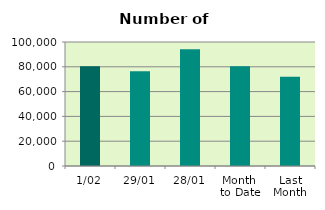
| Category | Series 0 |
|---|---|
| 1/02 | 80444 |
| 29/01 | 76356 |
| 28/01 | 94120 |
| Month 
to Date | 80444 |
| Last
Month | 71883.3 |